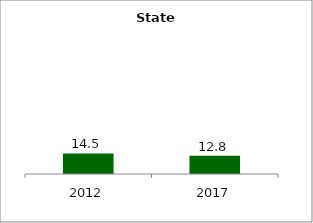
| Category | State |
|---|---|
| 2012.0 | 14.478 |
| 2017.0 | 12.81 |